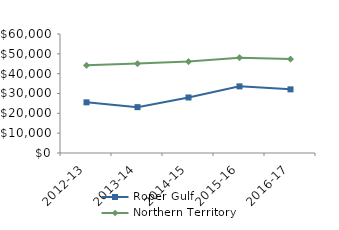
| Category | Roper Gulf | Northern Territory |
|---|---|---|
| 2012-13 | 25550 | 44232.02 |
| 2013-14 | 23121.28 | 45075.51 |
| 2014-15 | 27994.31 | 46083.65 |
| 2015-16 | 33597.5 | 48046.27 |
| 2016-17 | 32081.75 | 47367.05 |